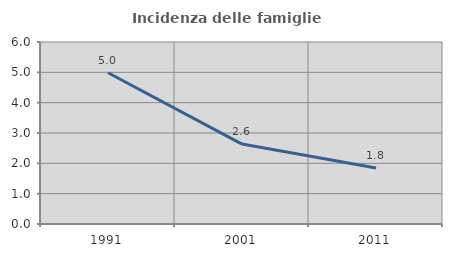
| Category | Incidenza delle famiglie numerose |
|---|---|
| 1991.0 | 4.987 |
| 2001.0 | 2.634 |
| 2011.0 | 1.843 |